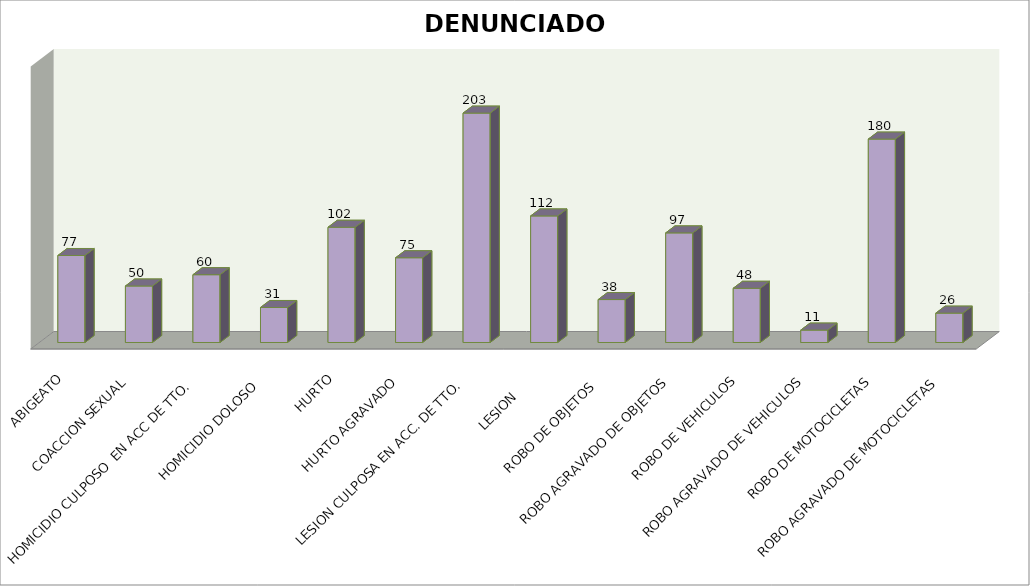
| Category | DENUNCIADOS |
|---|---|
| ABIGEATO | 77 |
| COACCION SEXUAL | 50 |
| HOMICIDIO CULPOSO  EN ACC DE TTO.  | 60 |
| HOMICIDIO DOLOSO  | 31 |
| HURTO | 102 |
| HURTO AGRAVADO | 75 |
| LESION CULPOSA EN ACC. DE TTO. | 203 |
| LESION      | 112 |
| ROBO DE OBJETOS  | 38 |
| ROBO AGRAVADO DE OBJETOS | 97 |
| ROBO DE VEHICULOS | 48 |
| ROBO AGRAVADO DE VEHICULOS | 11 |
| ROBO DE MOTOCICLETAS | 180 |
| ROBO AGRAVADO DE MOTOCICLETAS | 26 |